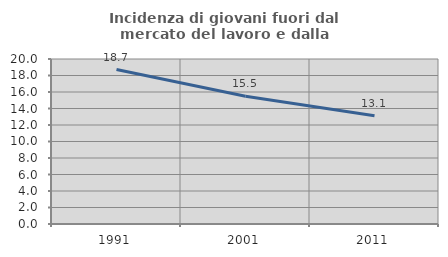
| Category | Incidenza di giovani fuori dal mercato del lavoro e dalla formazione  |
|---|---|
| 1991.0 | 18.724 |
| 2001.0 | 15.493 |
| 2011.0 | 13.115 |